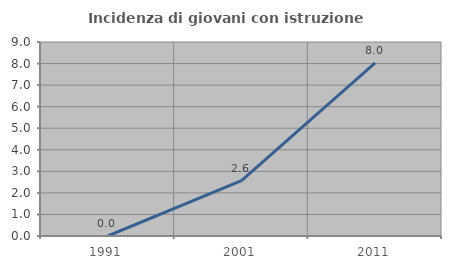
| Category | Incidenza di giovani con istruzione universitaria |
|---|---|
| 1991.0 | 0 |
| 2001.0 | 2.564 |
| 2011.0 | 8.036 |